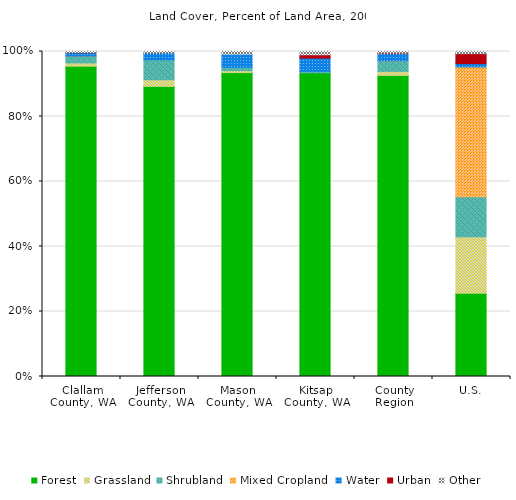
| Category | Forest | Grassland | Shrubland | Mixed Cropland  | Water | Urban | Other |
|---|---|---|---|---|---|---|---|
| Clallam County, WA | 0.93 | 0.01 | 0.02 | 0 | 0.01 | 0.001 | 0.003 |
| Jefferson County, WA | 0.87 | 0.02 | 0.06 | 0 | 0.02 | 0 | 0.005 |
| Mason County, WA | 0.92 | 0.006 | 0.01 | 0 | 0.04 | 0 | 0.008 |
| Kitsap County, WA | 0.92 | 0 | 0.005 | 0 | 0.04 | 0.01 | 0.01 |
| County Region | 0.905 | 0.012 | 0.031 | 0 | 0.022 | 0.001 | 0.005 |
| U.S. | 0.25 | 0.17 | 0.12 | 0.39 | 0.01 | 0.03 | 0.006 |